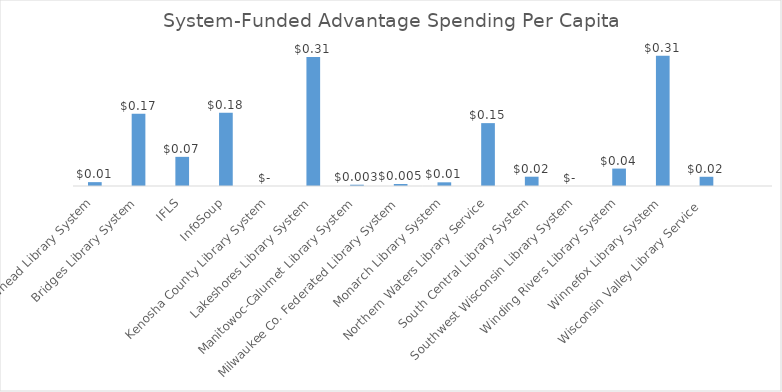
| Category | Per Capita |
|---|---|
| Arrowhead Library System | 0.009 |
| Bridges Library System | 0.173 |
| IFLS | 0.07 |
| InfoSoup | 0.176 |
| Kenosha County Library System | 0 |
| Lakeshores Library System | 0.309 |
| Manitowoc-Calumet Library System | 0.003 |
| Milwaukee Co. Federated Library System | 0.005 |
| Monarch Library System | 0.009 |
| Northern Waters Library Service | 0.151 |
| South Central Library System | 0.022 |
| Southwest Wisconsin Library System | 0 |
| Winding Rivers Library System | 0.042 |
| Winnefox Library System | 0.313 |
| Wisconsin Valley Library Service  | 0.022 |